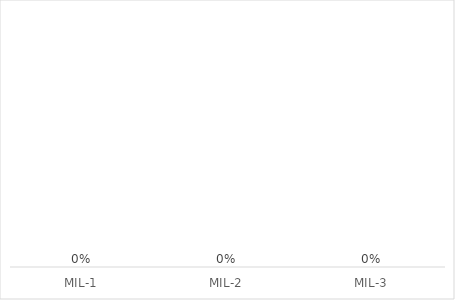
| Category | Complete % |
|---|---|
| MIL-1 | 0 |
| MIL-2 | 0 |
| MIL-3 | 0 |